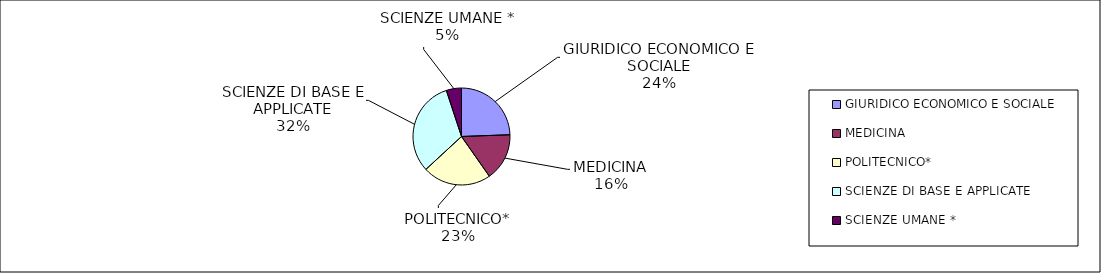
| Category | Series 0 |
|---|---|
| GIURIDICO ECONOMICO E SOCIALE | 106517.942 |
| MEDICINA | 69135.48 |
| POLITECNICO* | 99686.2 |
| SCIENZE DI BASE E APPLICATE | 138776.1 |
| SCIENZE UMANE * | 22037.498 |